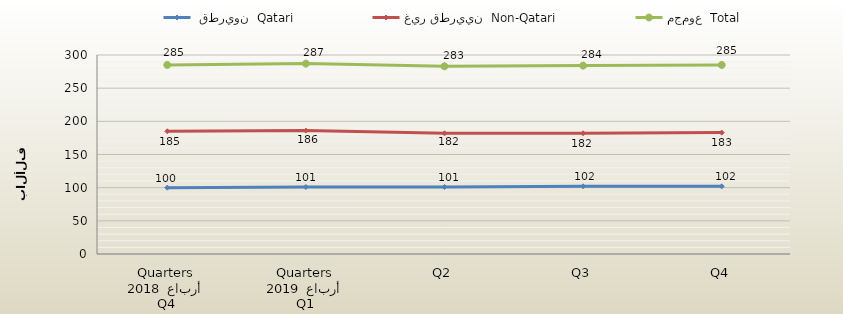
| Category |  قطريون  Qatari | غير قطريين  Non-Qatari | مجموع  Total |
|---|---|---|---|
| 0 | 100 | 185 | 285 |
| 1 | 101 | 186 | 287 |
| 2 | 101 | 182 | 283 |
| 3 | 102 | 182 | 284 |
| 4 | 102 | 183 | 285 |